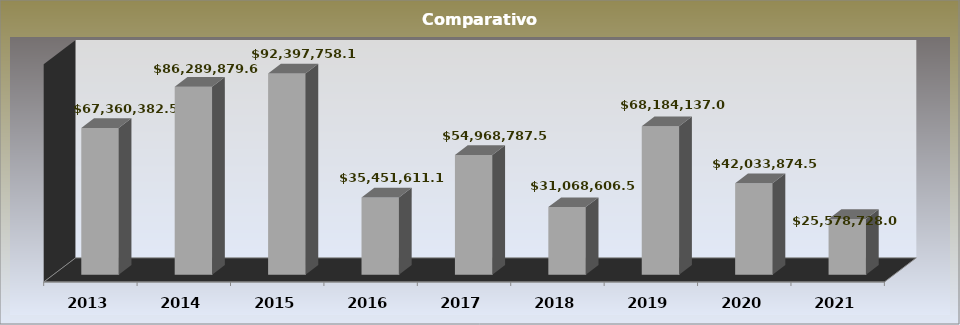
| Category | Series 0 |
|---|---|
| 2013.0 | 67360382.57 |
| 2014.0 | 86289879.62 |
| 2015.0 | 92397758.15 |
| 2016.0 | 35451611.18 |
| 2017.0 | 54968787.54 |
| 2018.0 | 31068606.51 |
| 2019.0 | 68184137.03 |
| 2020.0 | 42033874.55 |
| 2021.0 | 25578728 |